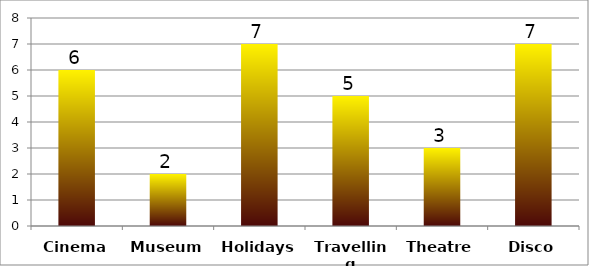
| Category | Series 0 |
|---|---|
| Cinema | 6 |
| Museum | 2 |
| Holidays | 7 |
| Travelling | 5 |
| Theatre | 3 |
| Disco | 7 |